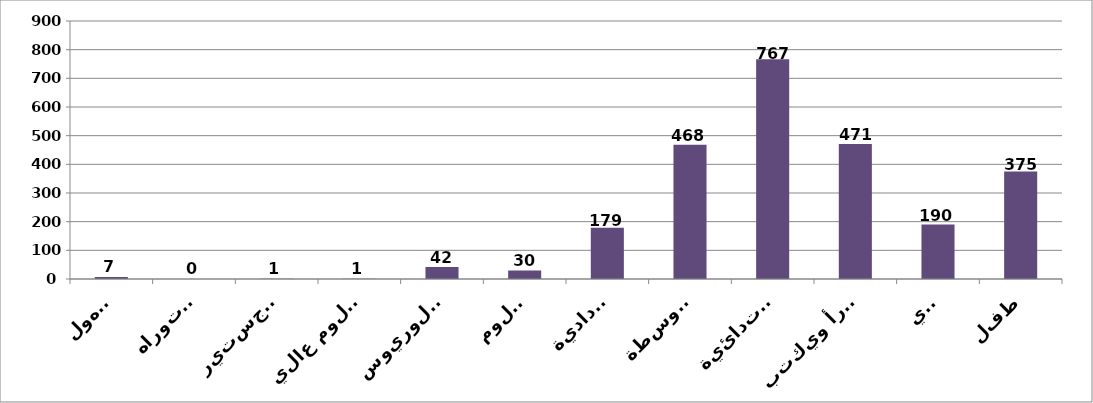
| Category | Series 0 |
|---|---|
| مجهول | 7 |
| دكتوراه | 0 |
| ماجستير | 1 |
| دبلوم عالي | 1 |
| بكلوريوس | 42 |
| دبلوم | 30 |
| اعدادية | 179 |
| متوسطة | 468 |
| ابتدائية | 767 |
| يقرأ ويكتب | 471 |
| امي | 190 |
| طفل | 375 |